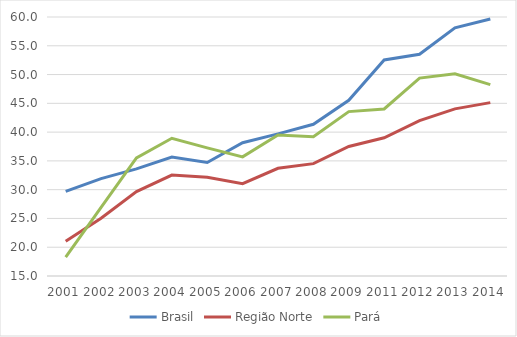
| Category | Brasil | Região Norte | Pará |
|---|---|---|---|
| 2001.0 | 29.688 | 21.054 | 18.285 |
| 2002.0 | 31.93 | 25.043 | 26.905 |
| 2003.0 | 33.607 | 29.661 | 35.533 |
| 2004.0 | 35.677 | 32.53 | 38.936 |
| 2005.0 | 34.718 | 32.17 | 37.259 |
| 2006.0 | 38.163 | 31.034 | 35.699 |
| 2007.0 | 39.695 | 33.709 | 39.507 |
| 2008.0 | 41.365 | 34.518 | 39.196 |
| 2009.0 | 45.537 | 37.501 | 43.562 |
| 2011.0 | 52.531 | 39.009 | 44.029 |
| 2012.0 | 53.525 | 41.987 | 49.385 |
| 2013.0 | 58.121 | 44.035 | 50.128 |
| 2014.0 | 59.64 | 45.121 | 48.242 |